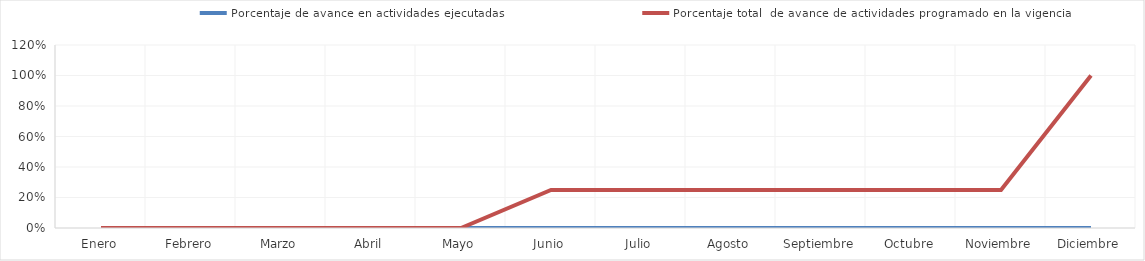
| Category | Porcentaje de avance en actividades ejecutadas | Porcentaje total  de avance de actividades programado en la vigencia |
|---|---|---|
| 0 | 0 | 0 |
| 1 | 0 | 0 |
| 2 | 0 | 0 |
| 3 | 0 | 0 |
| 4 | 0 | 0 |
| 5 | 0 | 0.25 |
| 6 | 0 | 0.25 |
| 7 | 0 | 0.25 |
| 8 | 0 | 0.25 |
| 9 | 0 | 0.25 |
| 10 | 0 | 0.25 |
| 11 | 0 | 1 |